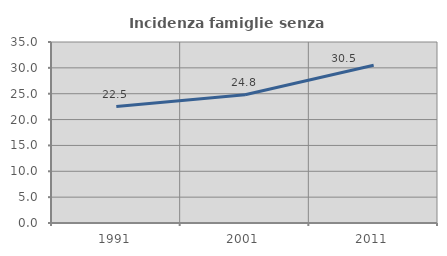
| Category | Incidenza famiglie senza nuclei |
|---|---|
| 1991.0 | 22.505 |
| 2001.0 | 24.816 |
| 2011.0 | 30.496 |